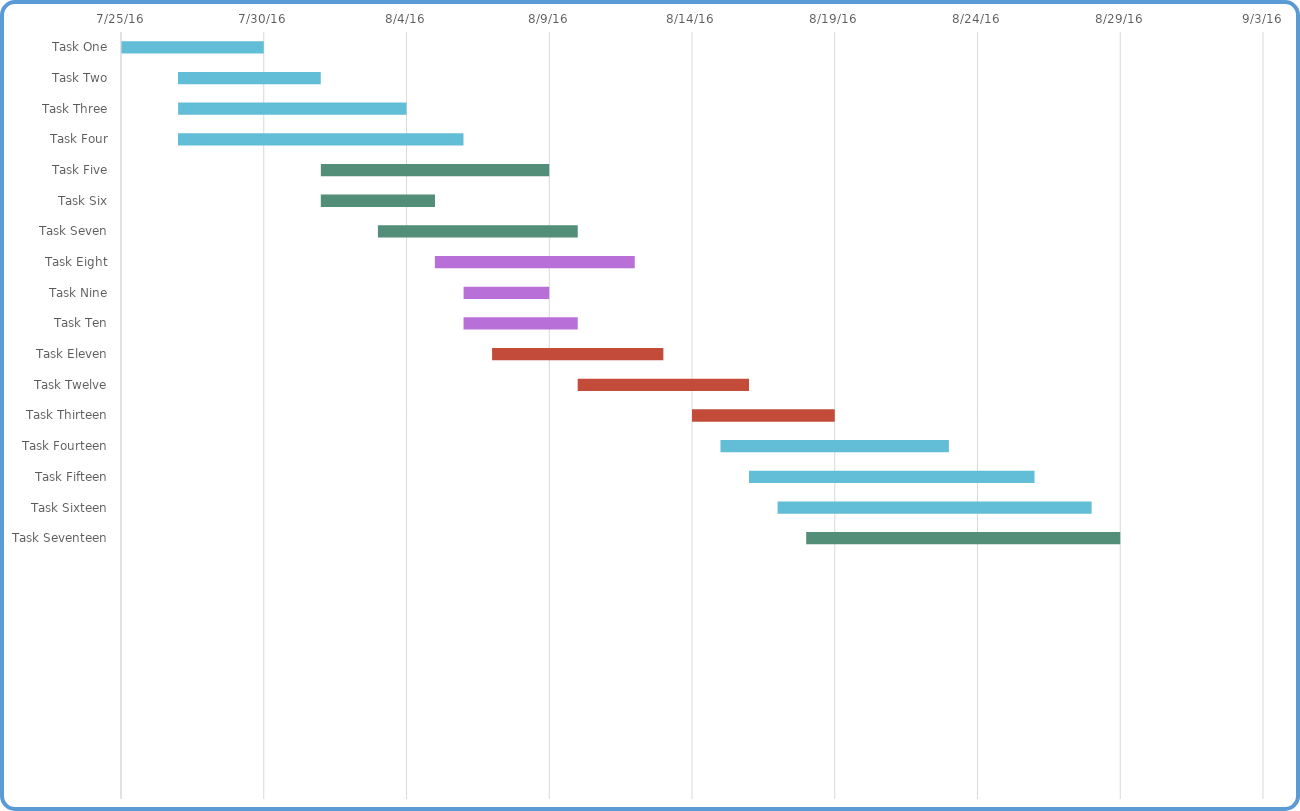
| Category | Start Date | Duration |
|---|---|---|
| Task One | 7/25/16 | 5 |
| Task Two | 7/27/16 | 5 |
| Task Three | 7/27/16 | 8 |
| Task Four | 7/27/16 | 10 |
| Task Five | 8/1/16 | 8 |
| Task Six | 8/1/16 | 4 |
| Task Seven | 8/3/16 | 7 |
| Task Eight | 8/5/16 | 7 |
| Task Nine | 8/6/16 | 3 |
| Task Ten | 8/6/16 | 4 |
| Task Eleven | 8/7/16 | 6 |
| Task Twelve | 8/10/16 | 6 |
| Task Thirteen | 8/14/16 | 5 |
| Task Fourteen | 8/15/16 | 8 |
| Task Fifteen | 8/16/16 | 10 |
| Task Sixteen | 8/17/16 | 11 |
| Task Seventeen | 8/18/16 | 11 |